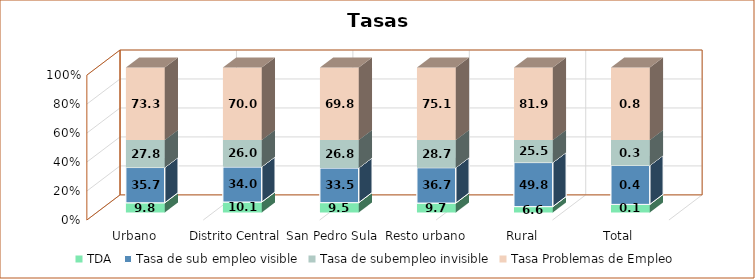
| Category | TDA  | Tasa de sub empleo visible | Tasa de subempleo invisible | Tasa Problemas de Empleo |
|---|---|---|---|---|
| Urbano | 9.787 | 35.714 | 27.843 | 73.345 |
| Distrito Central | 10.091 | 33.989 | 25.957 | 70.038 |
| San Pedro Sula | 9.475 | 33.472 | 26.839 | 69.786 |
| Resto urbano | 9.746 | 36.726 | 28.666 | 75.139 |
| Rural | 6.613 | 49.827 | 25.491 | 81.931 |
| Total | 0.086 | 0.412 | 0.269 | 0.767 |